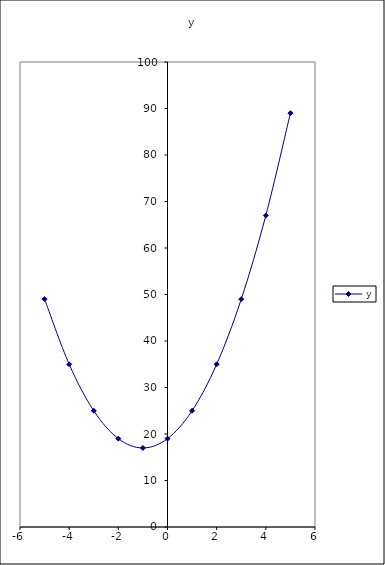
| Category | y |
|---|---|
| -5.0 | 49 |
| -4.0 | 35 |
| -3.0 | 25 |
| -2.0 | 19 |
| -1.0 | 17 |
| 0.0 | 19 |
| 1.0 | 25 |
| 2.0 | 35 |
| 3.0 | 49 |
| 4.0 | 67 |
| 5.0 | 89 |